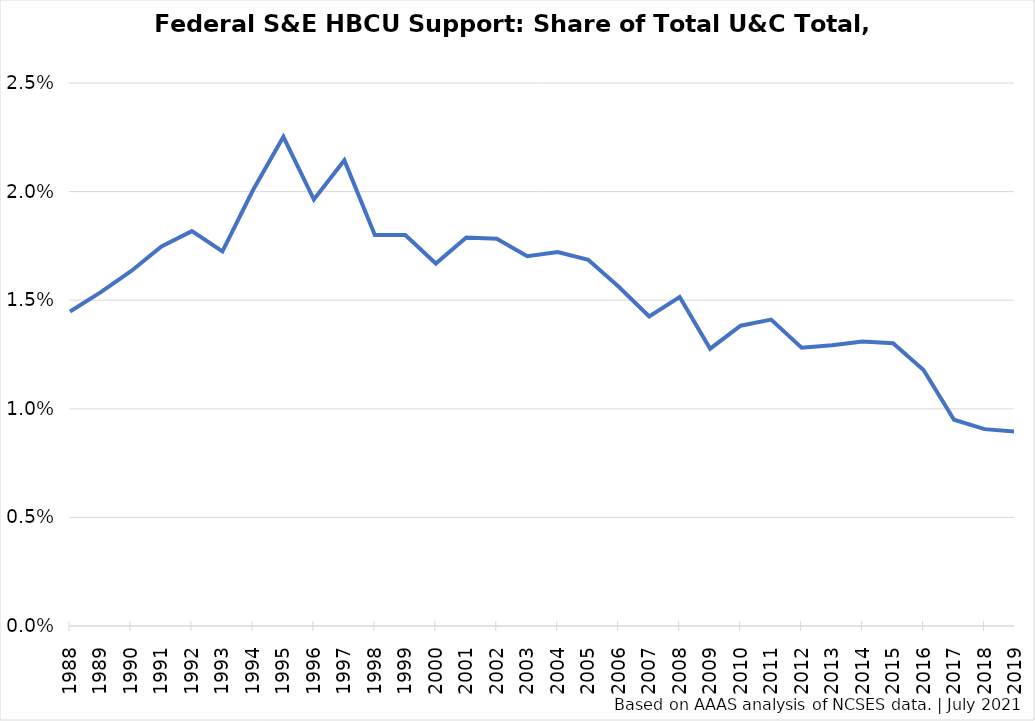
| Category | HBCU Share |
|---|---|
| 1988 | 0.014 |
| 1989 | 0.015 |
| 1990 | 0.016 |
| 1991 | 0.017 |
| 1992 | 0.018 |
| 1993 | 0.017 |
| 1994 | 0.02 |
| 1995 | 0.023 |
| 1996 | 0.02 |
| 1997 | 0.021 |
| 1998 | 0.018 |
| 1999 | 0.018 |
| 2000 | 0.017 |
| 2001 | 0.018 |
| 2002 | 0.018 |
| 2003 | 0.017 |
| 2004 | 0.017 |
| 2005 | 0.017 |
| 2006 | 0.016 |
| 2007 | 0.014 |
| 2008 | 0.015 |
| 2009 | 0.013 |
| 2010 | 0.014 |
| 2011 | 0.014 |
| 2012 | 0.013 |
| 2013 | 0.013 |
| 2014 | 0.013 |
| 2015 | 0.013 |
| 2016 | 0.012 |
| 2017 | 0.009 |
| 2018 | 0.009 |
| 2019 | 0.009 |